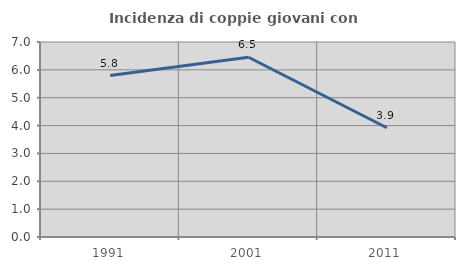
| Category | Incidenza di coppie giovani con figli |
|---|---|
| 1991.0 | 5.797 |
| 2001.0 | 6.452 |
| 2011.0 | 3.922 |